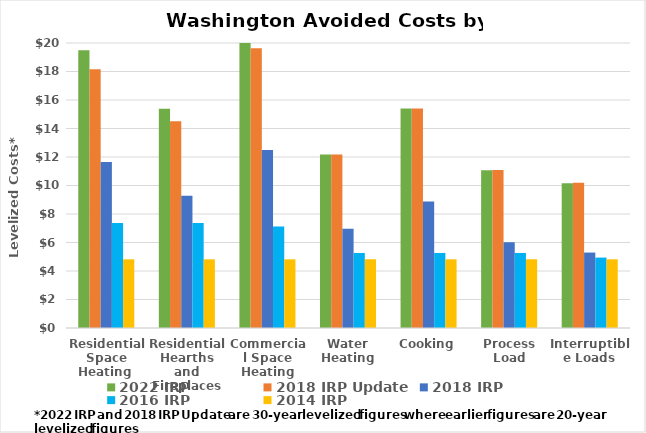
| Category | 2022 IRP | 2018 IRP Update | 2018 IRP | 2016 IRP | 2014 IRP |
|---|---|---|---|---|---|
| Residential Space Heating  | 19.492 | 18.162 | 11.654 | 7.376 | 4.82 |
| Residential Hearths and Fireplaces | 15.384 | 14.516 | 9.288 | 7.376 | 4.82 |
| Commercial Space Heating | 21.118 | 19.628 | 12.483 | 7.117 | 4.82 |
| Water Heating | 12.177 | 12.169 | 6.956 | 5.266 | 4.82 |
| Cooking | 15.404 | 15.404 | 8.883 | 5.266 | 4.82 |
| Process Load | 11.071 | 11.082 | 6.023 | 5.266 | 4.82 |
| Interruptible Loads | 10.152 | 10.197 | 5.294 | 4.941 | 4.82 |